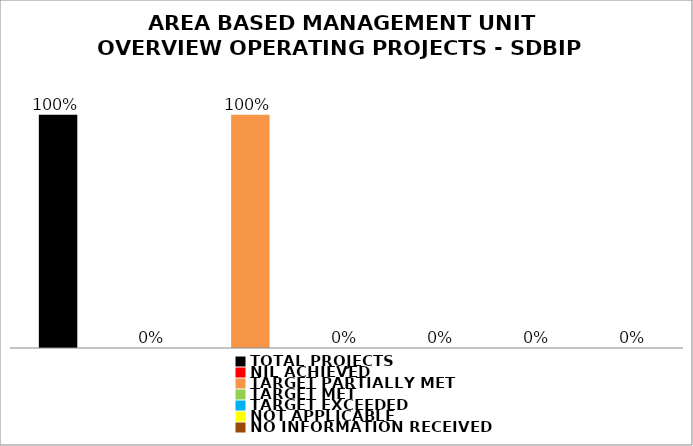
| Category | Series 0 |
|---|---|
| TOTAL PROJECTS | 1 |
| NIL ACHIEVED | 0 |
| TARGET PARTIALLY MET | 1 |
| TARGET MET | 0 |
| TARGET EXCEEDED | 0 |
| NOT APPLICABLE | 0 |
| NO INFORMATION RECEIVED | 0 |